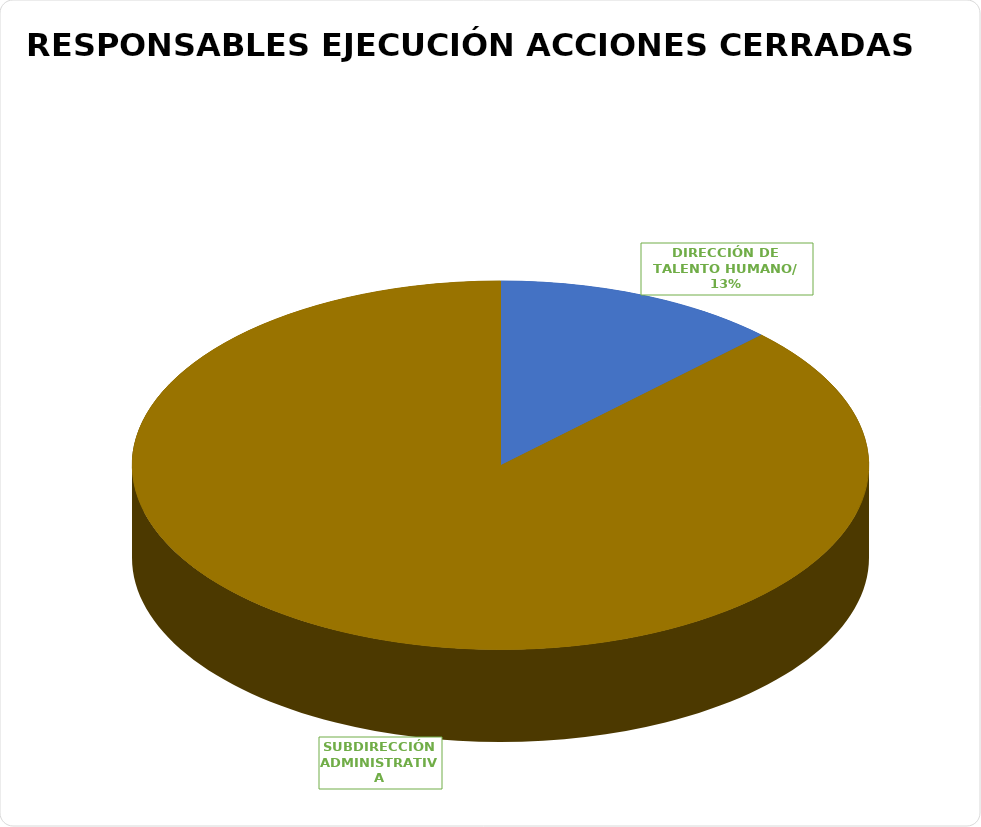
| Category | Total |
|---|---|
| DIRECCIÓN DE TALENTO HUMANO/
SUBDIRECCIÓN ADMINISTRATIVA/
SUBSECRETARÍA DE GESTIÓN
 CORPORATIVA/
OFICINA ASESORA DE PLANEACIÓN INSTITUCIONAL | 1 |
| SUBDIRECCIÓN ADMINISTRATIVA | 7 |